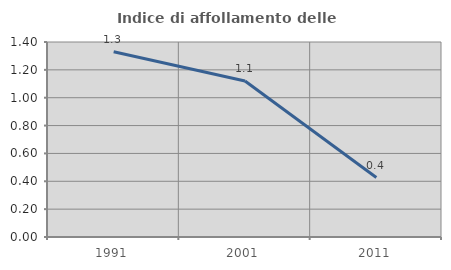
| Category | Indice di affollamento delle abitazioni  |
|---|---|
| 1991.0 | 1.33 |
| 2001.0 | 1.12 |
| 2011.0 | 0.427 |